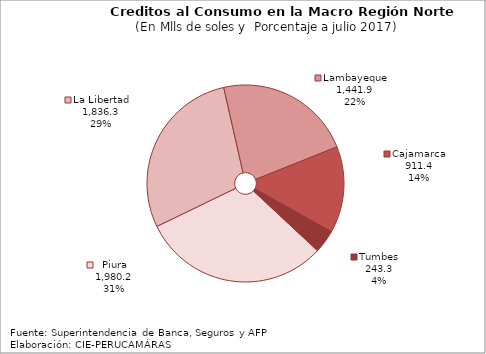
| Category | Series 0 |
|---|---|
| Piura | 1980.249 |
| La Libertad | 1836.311 |
| Lambayeque | 1441.941 |
| Cajamarca | 911.401 |
| Tumbes | 243.292 |